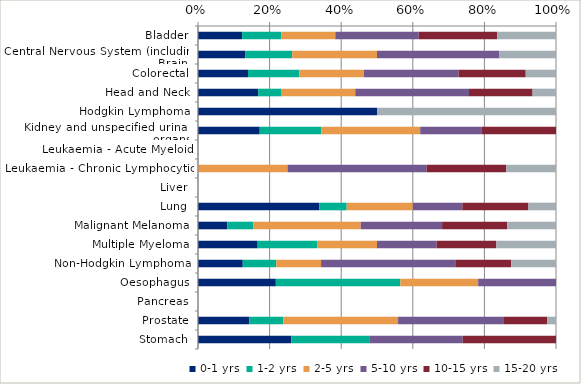
| Category | 0-1 yrs | 1-2 yrs | 2-5 yrs | 5-10 yrs | 10-15 yrs | 15-20 yrs |
|---|---|---|---|---|---|---|
| Bladder | 0.123 | 0.11 | 0.151 | 0.233 | 0.219 | 0.164 |
| Central Nervous System (including Brain) | 0.132 | 0.132 | 0.237 | 0.342 | 0 | 0.158 |
| Colorectal | 0.14 | 0.143 | 0.18 | 0.265 | 0.188 | 0.085 |
| Head and Neck | 0.168 | 0.065 | 0.206 | 0.318 | 0.178 | 0.065 |
| Hodgkin Lymphoma | 0.5 | 0 | 0 | 0 | 0 | 0.5 |
| Kidney and unspecified urinary organs | 0.172 | 0.172 | 0.276 | 0.172 | 0.207 | 0 |
| Leukaemia - Acute Myeloid | 0 | 0 | 0 | 0 | 0 | 0 |
| Leukaemia - Chronic Lymphocytic | 0 | 0 | 0.25 | 0.389 | 0.222 | 0.139 |
| Liver | 0 | 0 | 0 | 0 | 0 | 0 |
| Lung | 0.338 | 0.077 | 0.185 | 0.138 | 0.185 | 0.077 |
| Malignant Melanoma | 0.082 | 0.073 | 0.3 | 0.227 | 0.182 | 0.136 |
| Multiple Myeloma | 0.167 | 0.167 | 0.167 | 0.167 | 0.167 | 0.167 |
| Non-Hodgkin Lymphoma | 0.125 | 0.094 | 0.125 | 0.375 | 0.156 | 0.125 |
| Oesophagus | 0.217 | 0.348 | 0.217 | 0.217 | 0 | 0 |
| Pancreas | 0 | 0 | 0 | 0 | 0 | 0 |
| Prostate | 0.143 | 0.095 | 0.321 | 0.296 | 0.12 | 0.025 |
| Stomach | 0.261 | 0.217 | 0 | 0.261 | 0.261 | 0 |